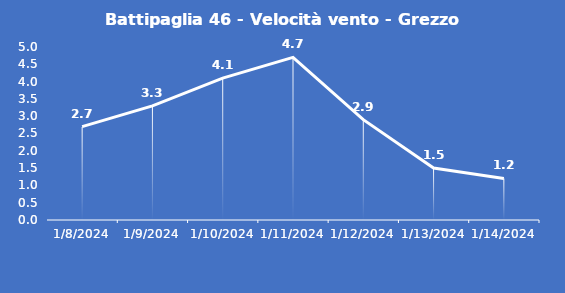
| Category | Battipaglia 46 - Velocità vento - Grezzo (m/s) |
|---|---|
| 1/8/24 | 2.7 |
| 1/9/24 | 3.3 |
| 1/10/24 | 4.1 |
| 1/11/24 | 4.7 |
| 1/12/24 | 2.9 |
| 1/13/24 | 1.5 |
| 1/14/24 | 1.2 |